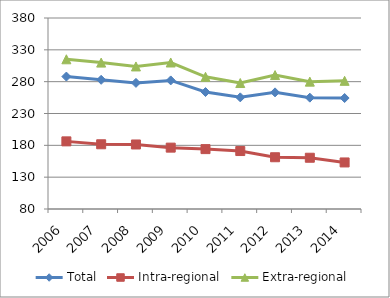
| Category | Total | Intra-regional | Extra-regional |
|---|---|---|---|
| 2006.0 | 288 | 186.225 | 315.14 |
| 2007.0 | 282.929 | 181.655 | 309.935 |
| 2008.0 | 278.094 | 181.334 | 303.896 |
| 2009.0 | 281.963 | 176.378 | 310.119 |
| 2010.0 | 263.71 | 174.066 | 287.615 |
| 2011.0 | 255.37 | 171.03 | 277.86 |
| 2012.0 | 263.195 | 161.288 | 290.37 |
| 2013.0 | 254.876 | 160.497 | 280.043 |
| 2014.0 | 254.32 | 153.113 | 281.308 |